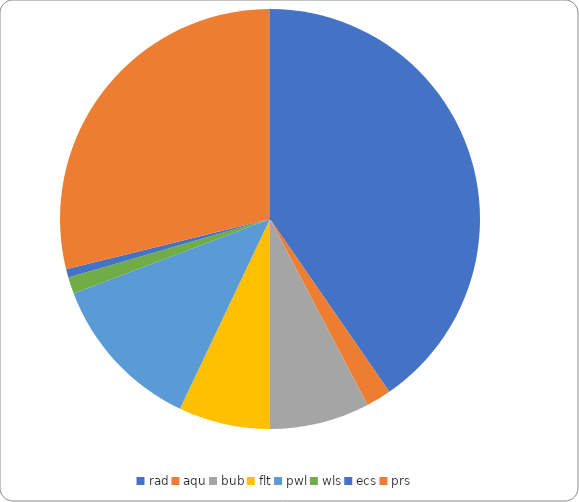
| Category | Amount |
|---|---|
| rad | 63 |
| aqu | 3 |
| bub | 12 |
| flt | 11 |
| pwl | 19 |
| wls | 2 |
| ecs | 1 |
| prs | 45 |